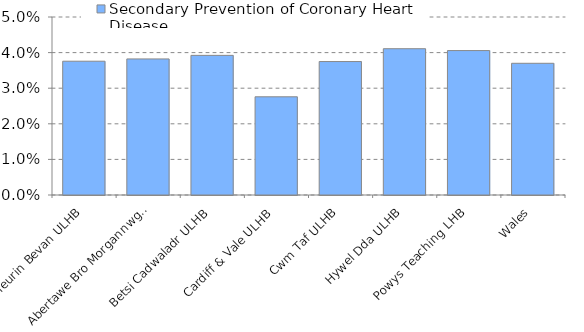
| Category | Secondary Prevention of Coronary Heart Disease  |
|---|---|
| Aneurin Bevan ULHB | 0.038 |
| Abertawe Bro Morgannwg ULHB | 0.038 |
| Betsi Cadwaladr ULHB | 0.039 |
| Cardiff & Vale ULHB | 0.028 |
| Cwm Taf ULHB | 0.037 |
| Hywel Dda ULHB | 0.041 |
| Powys Teaching LHB | 0.041 |
| Wales | 0.037 |